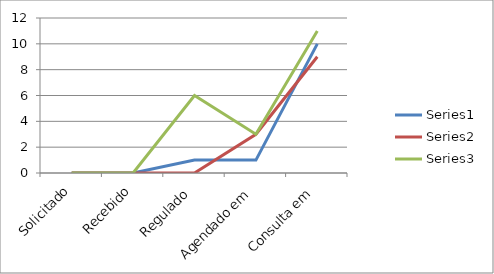
| Category | Series 0 | Series 1 | Series 2 |
|---|---|---|---|
| Solicitado | 0 | 0 | 0 |
| Recebido | 0 | 0 | 0 |
| Regulado | 1 | 0 | 6 |
| Agendado em | 1 | 3 | 3 |
| Consulta em | 10 | 9 | 11 |